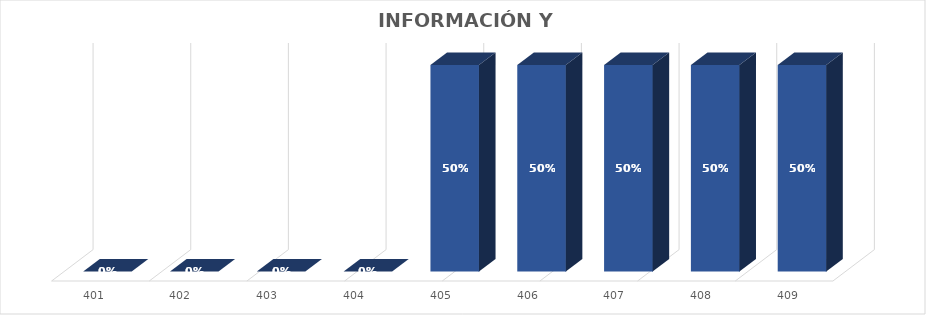
| Category | % Avance semestral |
|---|---|
| 401.0 | 0 |
| 402.0 | 0 |
| 403.0 | 0 |
| 404.0 | 0 |
| 405.0 | 0.5 |
| 406.0 | 0.5 |
| 407.0 | 0.5 |
| 408.0 | 0.5 |
| 409.0 | 0.5 |